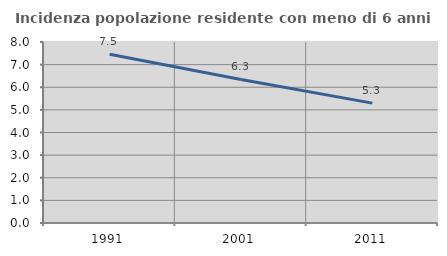
| Category | Incidenza popolazione residente con meno di 6 anni |
|---|---|
| 1991.0 | 7.46 |
| 2001.0 | 6.344 |
| 2011.0 | 5.299 |